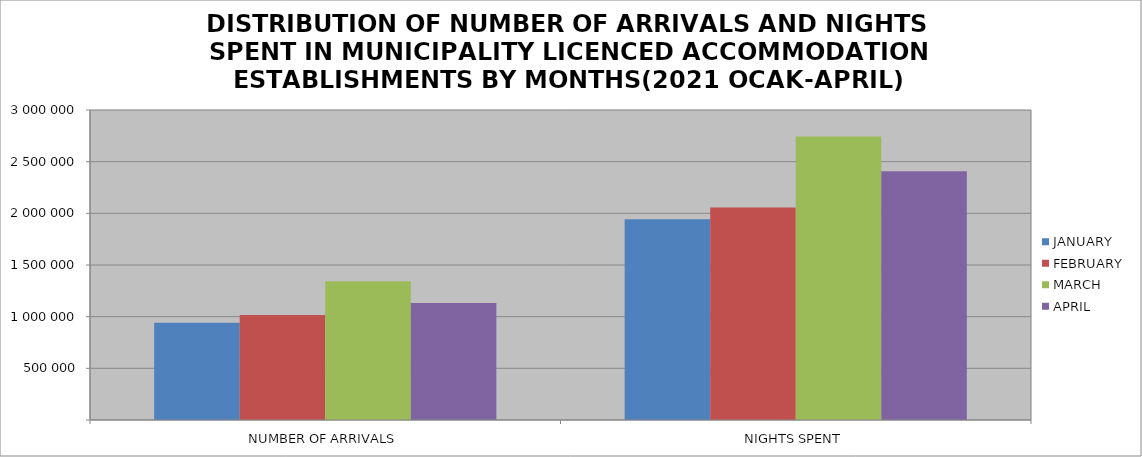
| Category | JANUARY | FEBRUARY | MARCH | APRIL |
|---|---|---|---|---|
| NUMBER OF ARRIVALS | 940331 | 1017199 | 1342202 | 1131069 |
| NIGHTS SPENT | 1943007 | 2056594 | 2743257 | 2406723 |